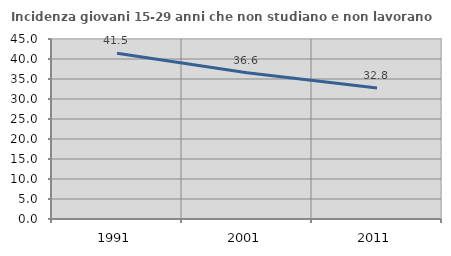
| Category | Incidenza giovani 15-29 anni che non studiano e non lavorano  |
|---|---|
| 1991.0 | 41.463 |
| 2001.0 | 36.567 |
| 2011.0 | 32.751 |